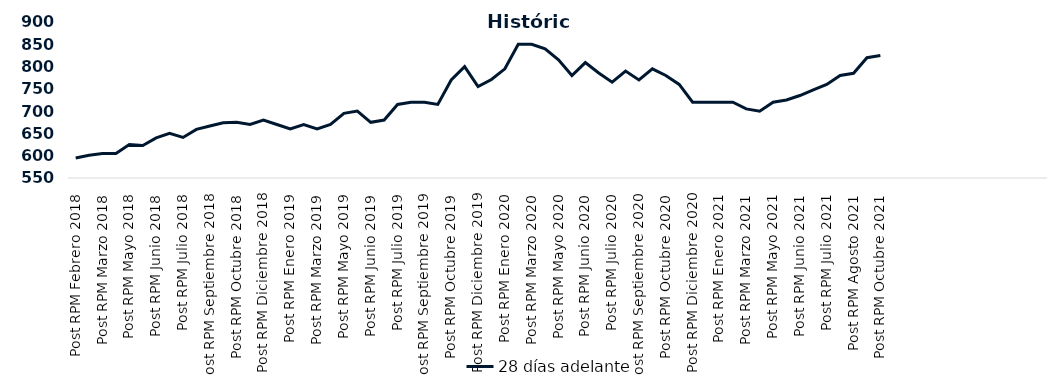
| Category | 28 días adelante |
|---|---|
| Post RPM Febrero 2018 | 595 |
| Pre RPM Marzo 2018 | 601 |
| Post RPM Marzo 2018 | 605 |
| Pre RPM Mayo 2018 | 605 |
| Post RPM Mayo 2018 | 625 |
| Pre RPM Junio 2018 | 623 |
| Post RPM Junio 2018 | 640 |
| Pre RPM Julio 2018 | 650 |
| Post RPM Julio 2018 | 641 |
| Pre RPM Septiembre 2018 | 659 |
| Post RPM Septiembre 2018 | 666.75 |
| Pre RPM Octubre 2018 | 674 |
| Post RPM Octubre 2018 | 675 |
| Pre RPM Diciembre 2018 | 670 |
| Post RPM Diciembre 2018 | 680 |
| Pre RPM Enero 2019 | 670 |
| Post RPM Enero 2019 | 660 |
| Pre RPM Marzo 2019 | 670 |
| Post RPM Marzo 2019 | 660 |
| Pre RPM Mayo 2019 | 670 |
| Post RPM Mayo 2019 | 695 |
| Pre RPM Junio 2019 | 700 |
| Post RPM Junio 2019 | 675 |
| Pre RPM Julio 2019 | 680 |
| Post RPM Julio 2019 | 715 |
| Pre RPM Septiembre 2019 | 720 |
| Post RPM Septiembre 2019 | 720 |
| Pre RPM Octubre 2019 | 715 |
| Post RPM Octubre 2019 | 770 |
| Pre RPM Diciembre 2019 | 800 |
| Post RPM Diciembre 2019 | 755 |
| Pre RPM Enero 2020 | 771 |
| Post RPM Enero 2020 | 795 |
| Pre RPM Marzo 2020 | 850 |
| Post RPM Marzo 2020 | 850 |
| Pre RPM Mayo 2020 | 840 |
| Post RPM Mayo 2020 | 815 |
| Pre RPM Junio 2020 | 780 |
| Post RPM Junio 2020 | 809 |
| Pre RPM Julio 2020 | 785.72 |
| Post RPM Julio 2020 | 765 |
| Pre RPM Septiembre 2020 | 790 |
| Post RPM Septiembre 2020 | 770 |
| Pre RPM Octubre 2020 | 795 |
| Post RPM Octubre 2020 | 780 |
| Pre RPM Diciembre 2020 | 760 |
| Post RPM Diciembre 2020 | 720 |
| Pre RPM Enero 2021 | 720 |
| Post RPM Enero 2021 | 720 |
| Pre RPM Marzo 2021 | 720 |
| Post RPM Marzo 2021 | 705 |
| Pre RPM Mayo 2021 | 700 |
| Post RPM Mayo 2021 | 720 |
| Pre RPM Junio 2021 | 725 |
| Post RPM Junio 2021 | 735 |
| Pre RPM Julio 2021 | 747.5 |
| Post RPM Julio 2021 | 760 |
| Pre RPM Agosto 2021 | 780 |
| Post RPM Agosto 2021 | 785 |
| Pre RPM Octubre 2021 | 820 |
| Post RPM Octubre 2021 | 825 |